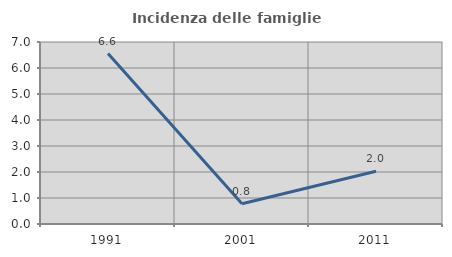
| Category | Incidenza delle famiglie numerose |
|---|---|
| 1991.0 | 6.557 |
| 2001.0 | 0.781 |
| 2011.0 | 2.032 |